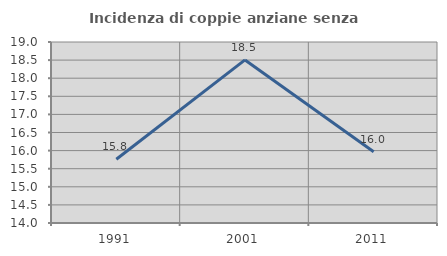
| Category | Incidenza di coppie anziane senza figli  |
|---|---|
| 1991.0 | 15.762 |
| 2001.0 | 18.505 |
| 2011.0 | 15.968 |